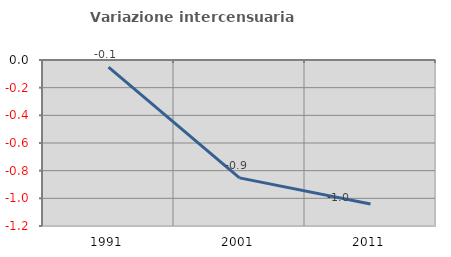
| Category | Variazione intercensuaria annua |
|---|---|
| 1991.0 | -0.051 |
| 2001.0 | -0.852 |
| 2011.0 | -1.041 |